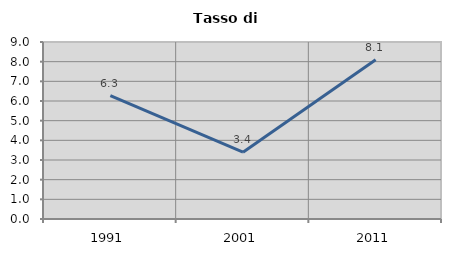
| Category | Tasso di disoccupazione   |
|---|---|
| 1991.0 | 6.271 |
| 2001.0 | 3.397 |
| 2011.0 | 8.1 |